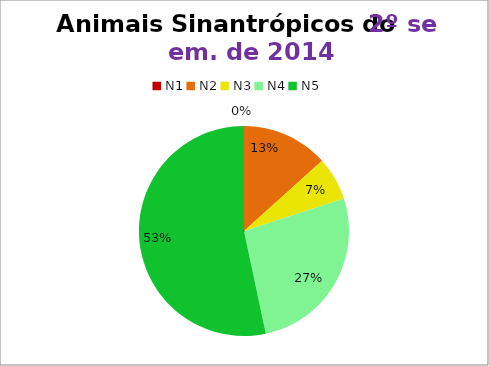
| Category | 2º/14 |
|---|---|
| N1 | 0 |
| N2 | 4 |
| N3 | 2 |
| N4 | 8 |
| N5 | 16 |